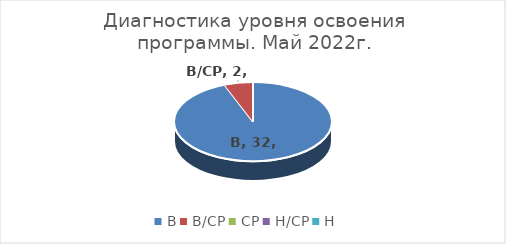
| Category | Золотая рыбка |
|---|---|
| В | 32 |
| В/СР | 2 |
| СР | 0 |
| Н/СР | 0 |
| Н | 0 |